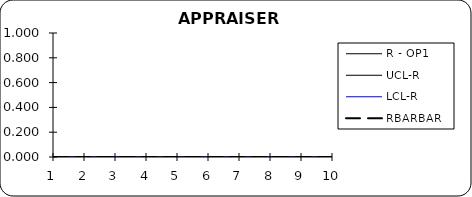
| Category | R - OP1 | UCL-R | LCL-R | RBARBAR |
|---|---|---|---|---|
| 0 | 0 | 0 | 0 | 0 |
| 1 | 0 | 0 | 0 | 0 |
| 2 | 0 | 0 | 0 | 0 |
| 3 | 0 | 0 | 0 | 0 |
| 4 | 0 | 0 | 0 | 0 |
| 5 | 0 | 0 | 0 | 0 |
| 6 | 0 | 0 | 0 | 0 |
| 7 | 0 | 0 | 0 | 0 |
| 8 | 0 | 0 | 0 | 0 |
| 9 | 0 | 0 | 0 | 0 |